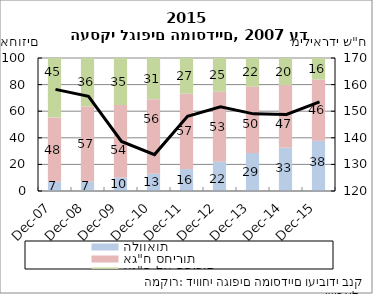
| Category | הלוואות | אג"ח סחירות | אג"ח לא סחירות |
|---|---|---|---|
| 2007-12-31 | 7.006 | 48.33 | 44.663 |
| 2008-12-31 | 6.914 | 56.625 | 36.461 |
| 2009-12-31 | 10.192 | 54.461 | 35.347 |
| 2010-12-31 | 12.918 | 56.16 | 30.922 |
| 2011-12-31 | 16.476 | 56.668 | 26.856 |
| 2012-12-31 | 22.025 | 52.707 | 25.268 |
| 2013-12-31 | 28.635 | 49.85 | 21.514 |
| 2014-12-31 | 32.565 | 47.118 | 20.317 |
| 2015-12-31 | 37.691 | 46.157 | 16.153 |